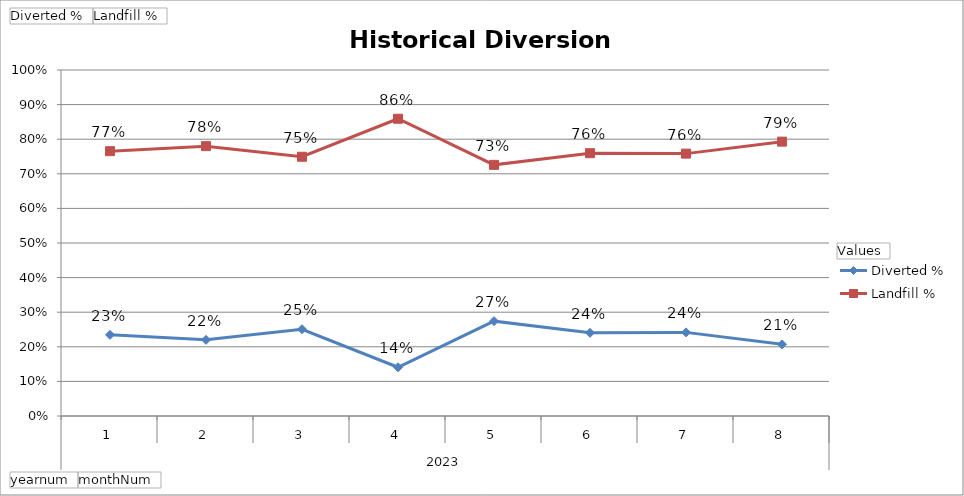
| Category | Diverted % | Landfill % |
|---|---|---|
| 0 | 0.235 | 0.765 |
| 1 | 0.22 | 0.78 |
| 2 | 0.251 | 0.749 |
| 3 | 0.141 | 0.859 |
| 4 | 0.274 | 0.726 |
| 5 | 0.24 | 0.76 |
| 6 | 0.242 | 0.758 |
| 7 | 0.207 | 0.793 |